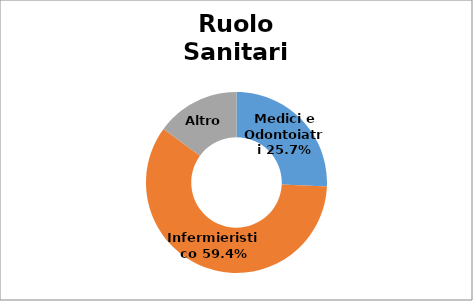
| Category | Series 0 |
|---|---|
| Medici e Odontoiatri | 0.257 |
| Infermieristico | 0.594 |
| Altro  | 0.149 |